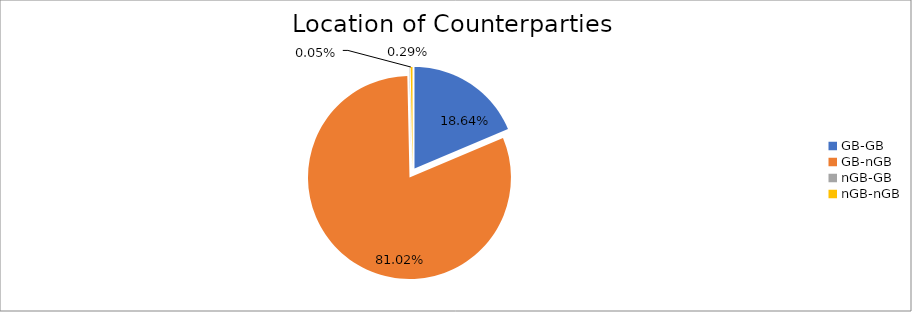
| Category | Series 0 |
|---|---|
| GB-GB | 1772136.979 |
| GB-nGB | 7704791.843 |
| nGB-GB | 4740.578 |
| nGB-nGB | 27745.638 |